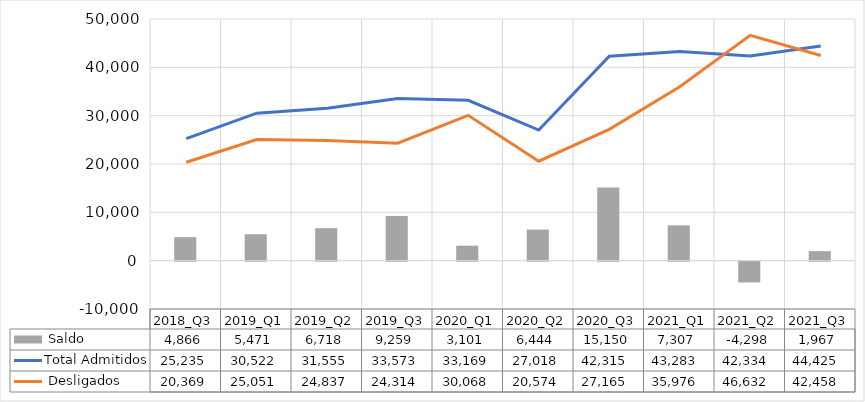
| Category | Total |
|---|---|
| 2018_Q3 | 4866 |
| 2019_Q1 | 5471 |
| 2019_Q2 | 6718 |
| 2019_Q3 | 9259 |
| 2020_Q1 | 3101 |
| 2020_Q2 | 6444 |
| 2020_Q3 | 15150 |
| 2021_Q1 | 7307 |
| 2021_Q2 | -4298 |
| 2021_Q3 | 1967 |